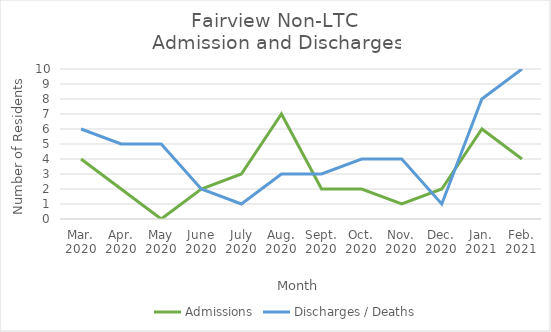
| Category | Admissions | Discharges / Deaths |
|---|---|---|
| Mar.
2020 | 4 | 6 |
| Apr.
2020 | 2 | 5 |
| May
2020 | 0 | 5 |
| June
2020 | 2 | 2 |
| July
2020 | 3 | 1 |
| Aug.
2020 | 7 | 3 |
| Sept.
2020 | 2 | 3 |
| Oct.
2020 | 2 | 4 |
| Nov.
2020 | 1 | 4 |
| Dec.
2020 | 2 | 1 |
| Jan.
2021 | 6 | 8 |
| Feb.
2021 | 4 | 10 |